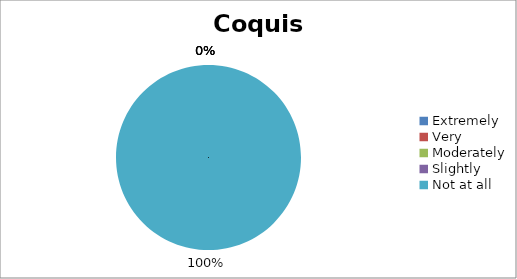
| Category | Coquis |
|---|---|
| Extremely | 0 |
| Very | 0 |
| Moderately | 0 |
| Slightly | 0 |
| Not at all | 3 |